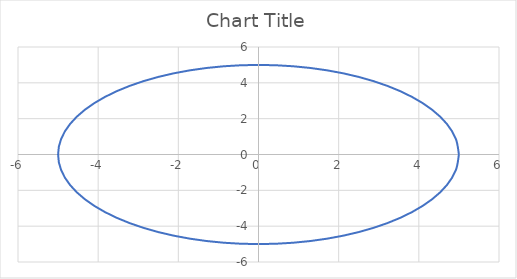
| Category | Series 0 |
|---|---|
| 5.0 | 0 |
| 4.92403876506104 | 0.868 |
| 4.698463103929543 | 1.71 |
| 4.330127018922194 | 2.5 |
| 3.83022221559489 | 3.214 |
| 3.2139380484326967 | 3.83 |
| 2.5000000000000004 | 4.33 |
| 1.7101007166283442 | 4.698 |
| 0.8682408883346521 | 4.924 |
| 3.06287113727155e-16 | 5 |
| -0.8682408883346515 | 4.924 |
| -1.7101007166283435 | 4.698 |
| -2.499999999999999 | 4.33 |
| -3.2139380484326967 | 3.83 |
| -3.8302222155948895 | 3.214 |
| -4.330127018922194 | 2.5 |
| -4.698463103929542 | 1.71 |
| -4.92403876506104 | 0.868 |
| -5.0 | 0 |
| -4.92403876506104 | -0.868 |
| -4.698463103929543 | -1.71 |
| -4.330127018922193 | -2.5 |
| -3.83022221559489 | -3.214 |
| -3.2139380484326976 | -3.83 |
| -2.500000000000002 | -4.33 |
| -1.7101007166283468 | -4.698 |
| -0.8682408883346516 | -4.924 |
| -9.18861341181465e-16 | -5 |
| 0.8682408883346499 | -4.924 |
| 1.7101007166283408 | -4.698 |
| 2.5000000000000004 | -4.33 |
| 3.2139380484326963 | -3.83 |
| 3.830222215594889 | -3.214 |
| 4.330127018922192 | -2.5 |
| 4.698463103929543 | -1.71 |
| 4.92403876506104 | -0.868 |
| 5.0 | 0 |